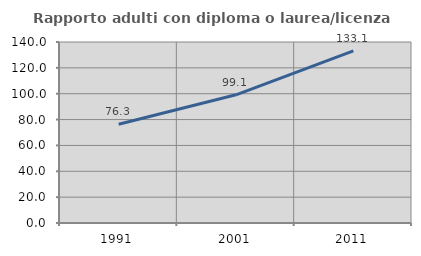
| Category | Rapporto adulti con diploma o laurea/licenza media  |
|---|---|
| 1991.0 | 76.336 |
| 2001.0 | 99.14 |
| 2011.0 | 133.1 |